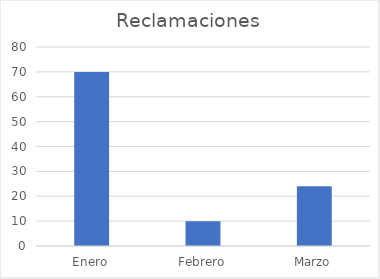
| Category | Reclamaciones |
|---|---|
| Enero | 70 |
| Febrero | 10 |
| Marzo | 24 |